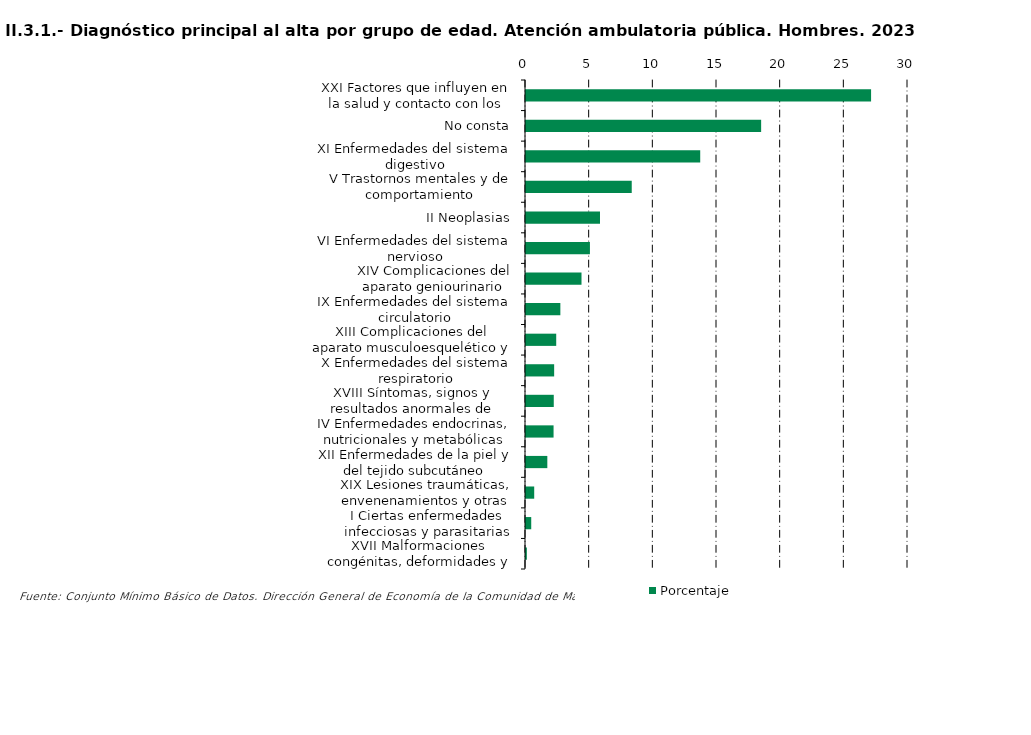
| Category | Porcentaje |
|---|---|
| XXI Factores que influyen en la salud y contacto con los servicios sanitarios | 27.101 |
| No consta | 18.467 |
| XI Enfermedades del sistema digestivo | 13.682 |
| V Trastornos mentales y de comportamiento | 8.304 |
| II Neoplasias | 5.811 |
| VI Enfermedades del sistema nervioso | 5.02 |
| XIV Complicaciones del aparato geniourinario | 4.359 |
| IX Enfermedades del sistema circulatorio | 2.698 |
| XIII Complicaciones del aparato musculoesquelético y del tejido conectivo | 2.373 |
| X Enfermedades del sistema respiratorio | 2.211 |
| XVIII Síntomas, signos y resultados anormales de pruebas complementarias, no clasificados bajo otro concepto | 2.181 |
| IV Enfermedades endocrinas, nutricionales y metabólicas | 2.165 |
| XII Enfermedades de la piel y del tejido subcutáneo | 1.675 |
| XIX Lesiones traumáticas, envenenamientos y otras consecuencias de causas externas | 0.645 |
| I Ciertas enfermedades infecciosas y parasitarias | 0.411 |
| XVII Malformaciones congénitas, deformidades y anomalías cromosómicas | 0.067 |